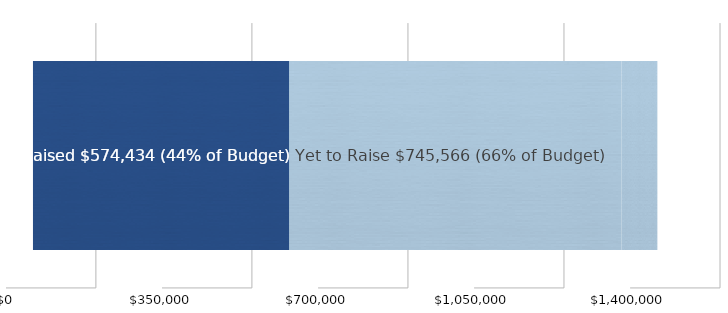
| Category | Raised on Indiegogo | Unraised |
|---|---|---|
| 0 | 574434 | 745566 |